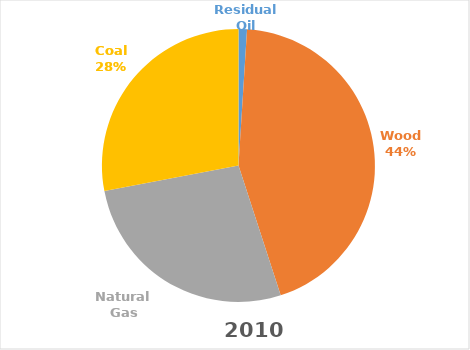
| Category | 2010 |
|---|---|
| Residual Oil | 1 |
| Wood | 44 |
| Natural Gas | 27 |
| Coal | 28 |